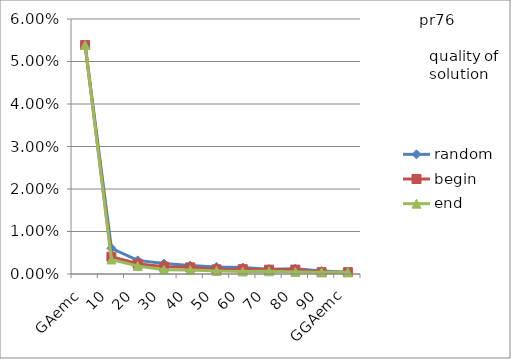
| Category | random | begin | end |
|---|---|---|---|
| 0 | 0.054 | 0.054 | 0.054 |
| 1 | 0.006 | 0.004 | 0.003 |
| 2 | 0.003 | 0.002 | 0.002 |
| 3 | 0.002 | 0.002 | 0.001 |
| 4 | 0.002 | 0.002 | 0.001 |
| 5 | 0.002 | 0.001 | 0.001 |
| 6 | 0.002 | 0.001 | 0.001 |
| 7 | 0.001 | 0.001 | 0.001 |
| 8 | 0.001 | 0.001 | 0 |
| 9 | 0.001 | 0 | 0 |
| 10 | 0 | 0 | 0 |